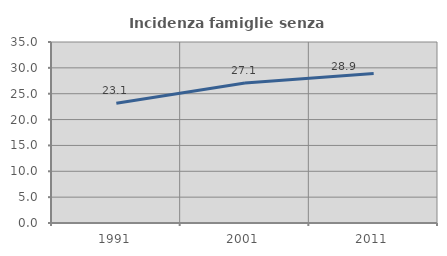
| Category | Incidenza famiglie senza nuclei |
|---|---|
| 1991.0 | 23.142 |
| 2001.0 | 27.072 |
| 2011.0 | 28.892 |